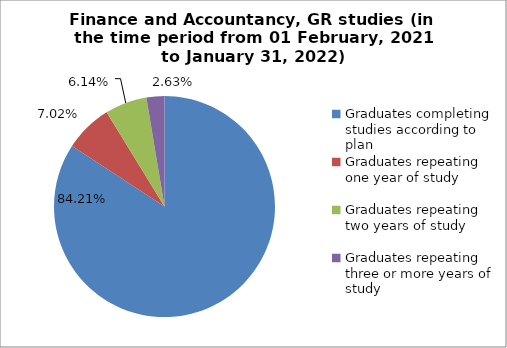
| Category | Series 0 |
|---|---|
| Graduates completing studies according to plan | 84.211 |
| Graduates repeating one year of study | 7.018 |
| Graduates repeating two years of study | 6.14 |
| Graduates repeating three or more years of study | 2.632 |